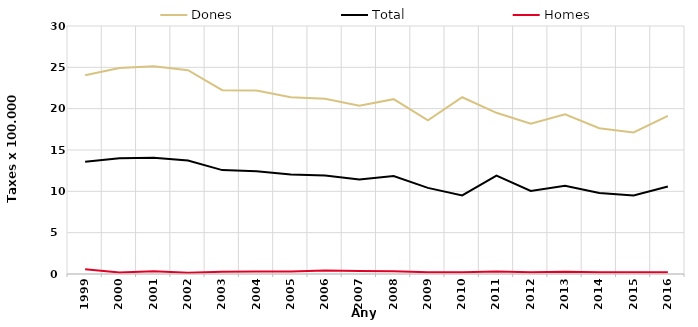
| Category | Dones | Total | Homes |
|---|---|---|---|
| 1999.0 | 24.03 | 13.58 | 0.56 |
| 2000.0 | 24.92 | 13.99 | 0.19 |
| 2001.0 | 25.14 | 14.07 | 0.33 |
| 2002.0 | 24.65 | 13.74 | 0.14 |
| 2003.0 | 22.24 | 12.57 | 0.28 |
| 2004.0 | 22.2 | 12.44 | 0.3 |
| 2005.0 | 21.39 | 12.03 | 0.3 |
| 2006.0 | 21.19 | 11.91 | 0.43 |
| 2007.0 | 20.35 | 11.44 | 0.37 |
| 2008.0 | 21.15 | 11.85 | 0.34 |
| 2009.0 | 18.59 | 10.42 | 0.2 |
| 2010.0 | 21.38 | 9.5 | 0.2 |
| 2011.0 | 19.5 | 11.91 | 0.29 |
| 2012.0 | 18.17 | 10.05 | 0.2 |
| 2013.0 | 19.31 | 10.67 | 0.26 |
| 2014.0 | 17.64 | 9.79 | 0.22 |
| 2015.0 | 17.13 | 9.5 | 0.2 |
| 2016.0 | 19.14 | 10.59 | 0.2 |